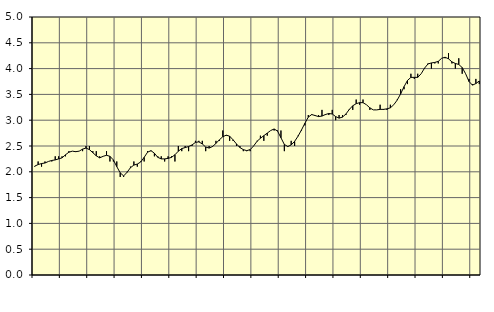
| Category | Piggar | Series 1 |
|---|---|---|
| nan | 2.1 | 2.11 |
| 87.0 | 2.2 | 2.14 |
| 87.0 | 2.1 | 2.16 |
| 87.0 | 2.2 | 2.17 |
| nan | 2.2 | 2.2 |
| 88.0 | 2.2 | 2.22 |
| 88.0 | 2.3 | 2.23 |
| 88.0 | 2.3 | 2.25 |
| nan | 2.3 | 2.27 |
| 89.0 | 2.3 | 2.33 |
| 89.0 | 2.4 | 2.38 |
| 89.0 | 2.4 | 2.4 |
| nan | 2.4 | 2.39 |
| 90.0 | 2.4 | 2.4 |
| 90.0 | 2.4 | 2.44 |
| 90.0 | 2.5 | 2.46 |
| nan | 2.5 | 2.43 |
| 91.0 | 2.4 | 2.37 |
| 91.0 | 2.4 | 2.31 |
| 91.0 | 2.3 | 2.27 |
| nan | 2.3 | 2.3 |
| 92.0 | 2.4 | 2.32 |
| 92.0 | 2.2 | 2.3 |
| 92.0 | 2.2 | 2.23 |
| nan | 2.2 | 2.1 |
| 93.0 | 1.9 | 1.98 |
| 93.0 | 1.9 | 1.92 |
| 93.0 | 2 | 1.99 |
| nan | 2.1 | 2.08 |
| 94.0 | 2.2 | 2.13 |
| 94.0 | 2.1 | 2.15 |
| 94.0 | 2.2 | 2.19 |
| nan | 2.2 | 2.28 |
| 95.0 | 2.4 | 2.38 |
| 95.0 | 2.4 | 2.41 |
| 95.0 | 2.3 | 2.36 |
| nan | 2.3 | 2.28 |
| 96.0 | 2.3 | 2.25 |
| 96.0 | 2.2 | 2.25 |
| 96.0 | 2.3 | 2.26 |
| nan | 2.3 | 2.28 |
| 97.0 | 2.2 | 2.33 |
| 97.0 | 2.5 | 2.4 |
| 97.0 | 2.4 | 2.45 |
| nan | 2.5 | 2.47 |
| 98.0 | 2.4 | 2.49 |
| 98.0 | 2.5 | 2.52 |
| 98.0 | 2.6 | 2.57 |
| nan | 2.6 | 2.58 |
| 99.0 | 2.6 | 2.54 |
| 99.0 | 2.4 | 2.48 |
| 99.0 | 2.5 | 2.46 |
| nan | 2.5 | 2.49 |
| 0.0 | 2.6 | 2.55 |
| 0.0 | 2.6 | 2.62 |
| 0.0 | 2.8 | 2.68 |
| nan | 2.7 | 2.71 |
| 1.0 | 2.6 | 2.69 |
| 1.0 | 2.6 | 2.62 |
| 1.0 | 2.5 | 2.54 |
| nan | 2.5 | 2.47 |
| 2.0 | 2.4 | 2.43 |
| 2.0 | 2.4 | 2.41 |
| 2.0 | 2.4 | 2.43 |
| nan | 2.5 | 2.5 |
| 3.0 | 2.6 | 2.59 |
| 3.0 | 2.7 | 2.65 |
| 3.0 | 2.6 | 2.7 |
| nan | 2.7 | 2.75 |
| 4.0 | 2.8 | 2.8 |
| 4.0 | 2.8 | 2.83 |
| 4.0 | 2.8 | 2.79 |
| nan | 2.8 | 2.66 |
| 5.0 | 2.4 | 2.53 |
| 5.0 | 2.5 | 2.49 |
| 5.0 | 2.6 | 2.52 |
| nan | 2.5 | 2.59 |
| 6.0 | 2.7 | 2.69 |
| 6.0 | 2.8 | 2.81 |
| 6.0 | 2.9 | 2.94 |
| nan | 3.1 | 3.06 |
| 7.0 | 3.1 | 3.11 |
| 7.0 | 3.1 | 3.09 |
| 7.0 | 3.1 | 3.07 |
| nan | 3.2 | 3.08 |
| 8.0 | 3.1 | 3.11 |
| 8.0 | 3.1 | 3.13 |
| 8.0 | 3.2 | 3.12 |
| nan | 3 | 3.07 |
| 9.0 | 3.1 | 3.04 |
| 9.0 | 3.1 | 3.06 |
| 9.0 | 3.1 | 3.12 |
| nan | 3.2 | 3.21 |
| 10.0 | 3.2 | 3.28 |
| 10.0 | 3.4 | 3.32 |
| 10.0 | 3.3 | 3.34 |
| nan | 3.4 | 3.34 |
| 11.0 | 3.3 | 3.3 |
| 11.0 | 3.2 | 3.24 |
| 11.0 | 3.2 | 3.2 |
| nan | 3.2 | 3.2 |
| 12.0 | 3.3 | 3.21 |
| 12.0 | 3.2 | 3.21 |
| 12.0 | 3.2 | 3.22 |
| nan | 3.3 | 3.24 |
| 13.0 | 3.3 | 3.3 |
| 13.0 | 3.4 | 3.39 |
| 13.0 | 3.6 | 3.51 |
| nan | 3.6 | 3.65 |
| 14.0 | 3.7 | 3.77 |
| 14.0 | 3.9 | 3.83 |
| 14.0 | 3.8 | 3.83 |
| nan | 3.9 | 3.83 |
| 15.0 | 3.9 | 3.9 |
| 15.0 | 4 | 4.01 |
| 15.0 | 4.1 | 4.09 |
| nan | 4 | 4.11 |
| 16.0 | 4.1 | 4.12 |
| 16.0 | 4.1 | 4.14 |
| 16.0 | 4.2 | 4.2 |
| nan | 4.2 | 4.22 |
| 17.0 | 4.3 | 4.19 |
| 17.0 | 4.1 | 4.13 |
| 17.0 | 4 | 4.1 |
| nan | 4.2 | 4.08 |
| 18.0 | 3.9 | 4.02 |
| 18.0 | 3.9 | 3.9 |
| 18.0 | 3.8 | 3.75 |
| nan | 3.7 | 3.68 |
| 19.0 | 3.8 | 3.71 |
| 19.0 | 3.7 | 3.76 |